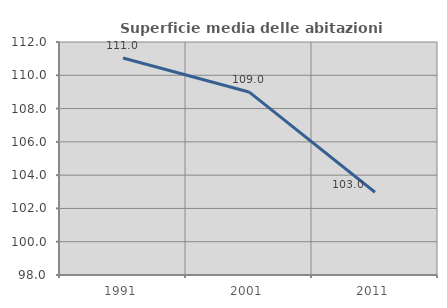
| Category | Superficie media delle abitazioni occupate |
|---|---|
| 1991.0 | 111.039 |
| 2001.0 | 108.999 |
| 2011.0 | 102.972 |